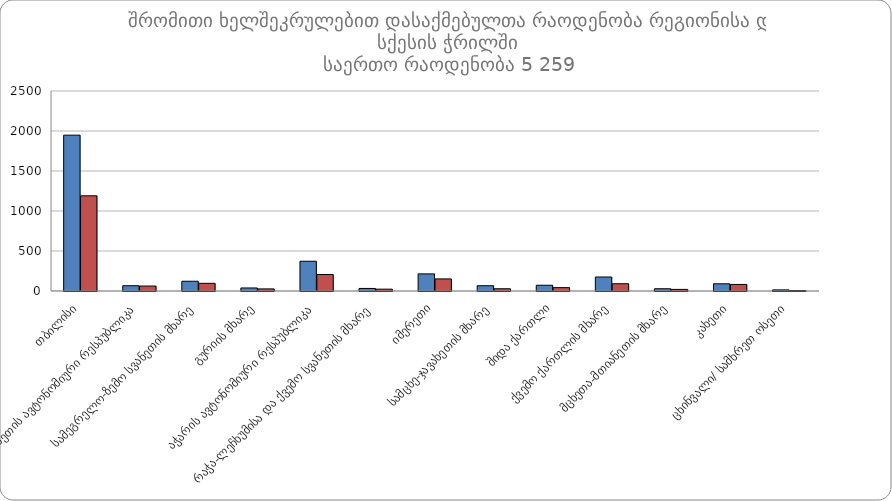
| Category |  მამრობითი |  მდედრობითი |
|---|---|---|
|  თბილისი | 1948 | 1190 |
|  აფხაზეთის ავტონომიური რესპუბლიკა | 66 | 62 |
|  სამეგრელო-ზემო სვანეთის მხარე | 122 | 96 |
|  გურიის მხარე | 38 | 26 |
|  აჭარის ავტონომიური რესპუბლიკა | 372 | 206 |
|  რაჭა-ლეჩხუმისა და ქვემო სვანეთის მხარე | 32 | 23 |
|  იმერეთი | 214 | 151 |
|  სამცხე-ჯავახეთის მხარე | 66 | 28 |
|  შიდა ქართლი | 72 | 42 |
|  ქვემო ქართლის მხარე | 175 | 91 |
|  მცხეთა-მთიანეთის მხარე | 28 | 20 |
|  კახეთი | 90 | 82 |
|  ცხინვალი/ სამხრეთ ოსეთი | 14 | 5 |